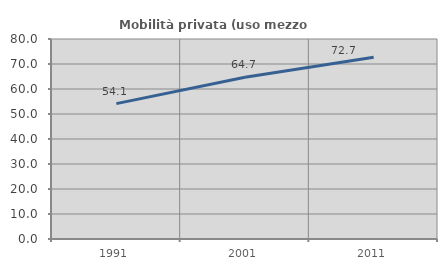
| Category | Mobilità privata (uso mezzo privato) |
|---|---|
| 1991.0 | 54.147 |
| 2001.0 | 64.738 |
| 2011.0 | 72.703 |